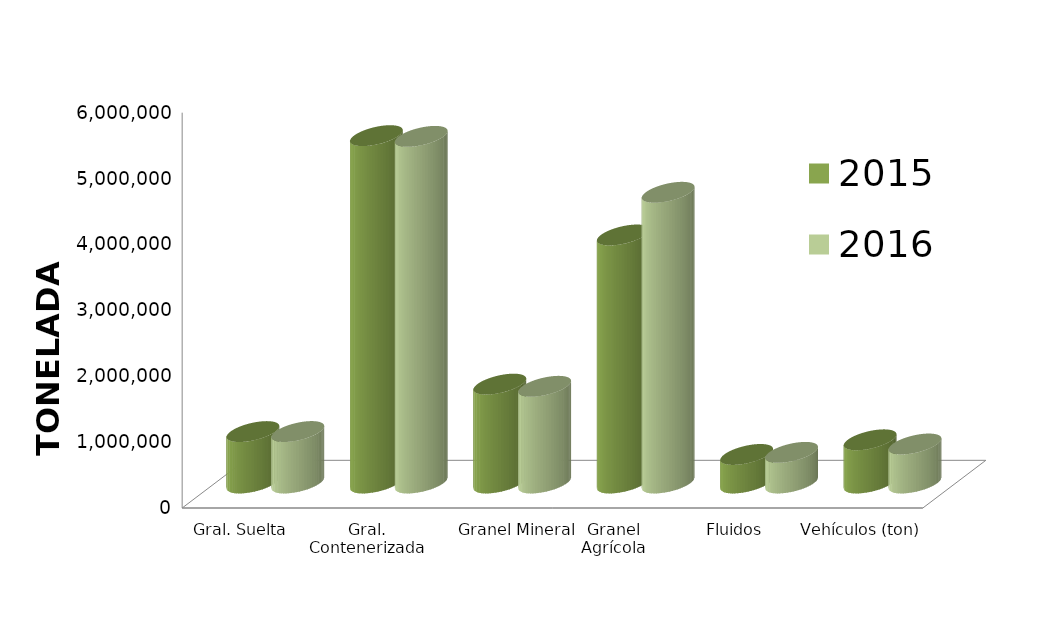
| Category | 2015 | 2016 |
|---|---|---|
| Gral. Suelta | 780447.331 | 780884.531 |
| Gral. Contenerizada | 5271871.292 | 5260918.542 |
| Granel Mineral | 1500492.89 | 1467349.948 |
| Granel Agrícola | 3764245.345 | 4412046.888 |
| Fluidos | 433197.354 | 464854.204 |
| Vehículos (ton) | 655335.746 | 591924.5 |